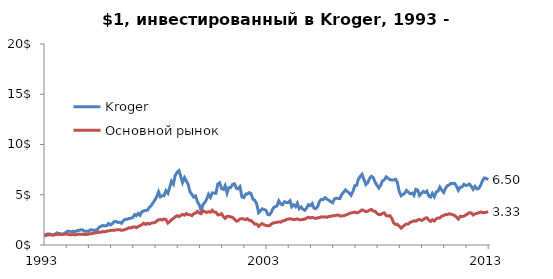
| Category | Kroger | Основной рынок |
|---|---|---|
| 1993-01-04 | 1 | 1 |
| 1993-02-01 | 0.929 | 1.01 |
| 1993-03-01 | 1.094 | 1.029 |
| 1993-04-01 | 1.107 | 1.003 |
| 1993-05-03 | 1.023 | 1.026 |
| 1993-06-01 | 0.987 | 1.027 |
| 1993-07-01 | 1.036 | 1.021 |
| 1993-08-02 | 1.209 | 1.056 |
| 1993-09-01 | 1.15 | 1.046 |
| 1993-10-01 | 1.122 | 1.066 |
| 1993-11-01 | 1.064 | 1.052 |
| 1993-12-01 | 1.15 | 1.063 |
| 1994-01-03 | 1.272 | 1.098 |
| 1994-02-01 | 1.379 | 1.065 |
| 1994-03-01 | 1.364 | 1.016 |
| 1994-04-04 | 1.3 | 1.028 |
| 1994-05-02 | 1.364 | 1.04 |
| 1994-06-01 | 1.328 | 1.013 |
| 1994-07-01 | 1.43 | 1.044 |
| 1994-08-01 | 1.45 | 1.084 |
| 1994-09-01 | 1.522 | 1.055 |
| 1994-10-03 | 1.494 | 1.077 |
| 1994-11-01 | 1.372 | 1.034 |
| 1994-12-01 | 1.379 | 1.047 |
| 1995-01-03 | 1.351 | 1.072 |
| 1995-02-01 | 1.501 | 1.111 |
| 1995-03-01 | 1.509 | 1.141 |
| 1995-04-03 | 1.45 | 1.173 |
| 1995-05-01 | 1.486 | 1.216 |
| 1995-06-01 | 1.537 | 1.242 |
| 1995-07-03 | 1.779 | 1.281 |
| 1995-08-01 | 1.865 | 1.281 |
| 1995-09-01 | 1.952 | 1.332 |
| 1995-10-02 | 1.908 | 1.325 |
| 1995-11-01 | 1.916 | 1.38 |
| 1995-12-01 | 2.137 | 1.404 |
| 1996-01-02 | 1.987 | 1.45 |
| 1996-02-01 | 2.122 | 1.46 |
| 1996-03-01 | 2.316 | 1.471 |
| 1996-04-01 | 2.351 | 1.491 |
| 1996-05-01 | 2.244 | 1.525 |
| 1996-06-03 | 2.26 | 1.528 |
| 1996-07-01 | 2.158 | 1.458 |
| 1996-08-01 | 2.422 | 1.486 |
| 1996-09-03 | 2.56 | 1.566 |
| 1996-10-01 | 2.552 | 1.607 |
| 1996-11-01 | 2.639 | 1.725 |
| 1996-12-02 | 2.659 | 1.688 |
| 1997-01-02 | 2.73 | 1.792 |
| 1997-02-03 | 3.031 | 1.802 |
| 1997-03-03 | 2.916 | 1.726 |
| 1997-04-01 | 3.145 | 1.826 |
| 1997-05-01 | 2.959 | 1.933 |
| 1997-06-02 | 3.316 | 2.017 |
| 1997-07-01 | 3.382 | 2.175 |
| 1997-08-01 | 3.445 | 2.05 |
| 1997-09-02 | 3.453 | 2.159 |
| 1997-10-01 | 3.733 | 2.084 |
| 1997-11-03 | 3.939 | 2.177 |
| 1997-12-01 | 4.204 | 2.212 |
| 1998-01-02 | 4.476 | 2.234 |
| 1998-02-02 | 4.832 | 2.391 |
| 1998-03-02 | 5.282 | 2.511 |
| 1998-04-01 | 4.789 | 2.534 |
| 1998-05-01 | 4.911 | 2.486 |
| 1998-06-01 | 4.903 | 2.584 |
| 1998-07-01 | 5.41 | 2.554 |
| 1998-08-03 | 5.145 | 2.182 |
| 1998-09-01 | 5.718 | 2.318 |
| 1998-10-01 | 6.346 | 2.504 |
| 1998-11-02 | 6.069 | 2.652 |
| 1998-12-01 | 6.919 | 2.801 |
| 1999-01-04 | 7.262 | 2.916 |
| 1999-02-01 | 7.397 | 2.822 |
| 1999-03-01 | 6.847 | 2.932 |
| 1999-04-01 | 6.211 | 3.043 |
| 1999-05-03 | 6.697 | 2.967 |
| 1999-06-01 | 6.389 | 3.128 |
| 1999-07-01 | 6.048 | 3.028 |
| 1999-08-02 | 5.288 | 3.009 |
| 1999-09-01 | 5.046 | 2.923 |
| 1999-10-01 | 4.761 | 3.106 |
| 1999-11-01 | 4.875 | 3.165 |
| 1999-12-01 | 4.316 | 3.348 |
| 2000-01-03 | 3.972 | 3.178 |
| 2000-02-01 | 3.417 | 3.114 |
| 2000-03-01 | 4.015 | 3.415 |
| 2000-04-03 | 4.244 | 3.31 |
| 2000-05-01 | 4.545 | 3.238 |
| 2000-06-01 | 5.046 | 3.315 |
| 2000-07-03 | 4.733 | 3.261 |
| 2000-08-01 | 5.191 | 3.459 |
| 2000-09-01 | 5.16 | 3.274 |
| 2000-10-02 | 5.16 | 3.258 |
| 2000-11-01 | 6.061 | 2.997 |
| 2000-12-01 | 6.188 | 3.009 |
| 2001-01-02 | 5.616 | 3.113 |
| 2001-02-01 | 5.545 | 2.826 |
| 2001-03-01 | 5.898 | 2.644 |
| 2001-04-02 | 5.168 | 2.848 |
| 2001-05-01 | 5.705 | 2.862 |
| 2001-06-01 | 5.718 | 2.79 |
| 2001-07-02 | 6.028 | 2.76 |
| 2001-08-01 | 6.089 | 2.583 |
| 2001-09-04 | 5.636 | 2.372 |
| 2001-10-01 | 5.595 | 2.415 |
| 2001-11-01 | 5.791 | 2.597 |
| 2001-12-03 | 4.774 | 2.617 |
| 2002-01-02 | 4.712 | 2.576 |
| 2002-02-04 | 5.066 | 2.522 |
| 2002-03-01 | 5.069 | 2.615 |
| 2002-04-01 | 5.209 | 2.454 |
| 2002-05-01 | 5.112 | 2.432 |
| 2002-06-03 | 4.552 | 2.256 |
| 2002-07-01 | 4.455 | 2.078 |
| 2002-08-01 | 4.135 | 2.088 |
| 2002-09-03 | 3.224 | 1.858 |
| 2002-10-01 | 3.384 | 2.019 |
| 2002-11-01 | 3.598 | 2.134 |
| 2002-12-02 | 3.534 | 2.005 |
| 2003-01-02 | 3.45 | 1.95 |
| 2003-02-03 | 3.023 | 1.917 |
| 2003-03-03 | 3.008 | 1.933 |
| 2003-04-01 | 3.27 | 2.09 |
| 2003-05-01 | 3.672 | 2.196 |
| 2003-06-02 | 3.814 | 2.221 |
| 2003-07-01 | 3.878 | 2.257 |
| 2003-08-01 | 4.394 | 2.297 |
| 2003-09-02 | 4.087 | 2.27 |
| 2003-10-01 | 4 | 2.395 |
| 2003-11-03 | 4.313 | 2.412 |
| 2003-12-01 | 4.234 | 2.534 |
| 2004-01-02 | 4.239 | 2.578 |
| 2004-02-02 | 4.397 | 2.609 |
| 2004-03-01 | 3.807 | 2.567 |
| 2004-04-01 | 4.003 | 2.524 |
| 2004-05-03 | 3.817 | 2.554 |
| 2004-06-01 | 4.163 | 2.6 |
| 2004-07-01 | 3.613 | 2.511 |
| 2004-08-02 | 3.781 | 2.517 |
| 2004-09-01 | 3.55 | 2.54 |
| 2004-10-01 | 3.455 | 2.576 |
| 2004-11-01 | 3.7 | 2.675 |
| 2004-12-01 | 4.013 | 2.762 |
| 2005-01-03 | 3.911 | 2.692 |
| 2005-02-01 | 4.115 | 2.743 |
| 2005-03-01 | 3.667 | 2.691 |
| 2005-04-01 | 3.608 | 2.637 |
| 2005-05-02 | 3.835 | 2.715 |
| 2005-06-01 | 4.354 | 2.715 |
| 2005-07-01 | 4.539 | 2.813 |
| 2005-08-01 | 4.514 | 2.781 |
| 2005-09-01 | 4.71 | 2.801 |
| 2005-10-03 | 4.552 | 2.751 |
| 2005-11-01 | 4.45 | 2.848 |
| 2005-12-01 | 4.318 | 2.845 |
| 2006-01-03 | 4.209 | 2.917 |
| 2006-02-01 | 4.583 | 2.919 |
| 2006-03-01 | 4.656 | 2.951 |
| 2006-04-03 | 4.634 | 2.987 |
| 2006-05-01 | 4.613 | 2.895 |
| 2006-06-01 | 5.015 | 2.895 |
| 2006-07-03 | 5.262 | 2.91 |
| 2006-08-01 | 5.478 | 2.971 |
| 2006-09-01 | 5.326 | 3.044 |
| 2006-10-02 | 5.176 | 3.14 |
| 2006-11-01 | 4.952 | 3.192 |
| 2006-12-01 | 5.323 | 3.232 |
| 2007-01-03 | 5.908 | 3.278 |
| 2007-02-01 | 5.931 | 3.206 |
| 2007-03-01 | 6.537 | 3.238 |
| 2007-04-02 | 6.827 | 3.378 |
| 2007-05-01 | 7.033 | 3.488 |
| 2007-06-01 | 6.524 | 3.426 |
| 2007-07-02 | 6.023 | 3.317 |
| 2007-08-01 | 6.183 | 3.359 |
| 2007-09-04 | 6.636 | 3.48 |
| 2007-10-01 | 6.837 | 3.531 |
| 2007-11-01 | 6.707 | 3.376 |
| 2007-12-03 | 6.232 | 3.346 |
| 2008-01-02 | 5.939 | 3.142 |
| 2008-02-01 | 5.674 | 3.033 |
| 2008-03-03 | 5.944 | 3.014 |
| 2008-04-01 | 6.377 | 3.158 |
| 2008-05-01 | 6.489 | 3.192 |
| 2008-06-02 | 6.779 | 2.917 |
| 2008-07-01 | 6.639 | 2.888 |
| 2008-08-01 | 6.504 | 2.924 |
| 2008-09-02 | 6.471 | 2.658 |
| 2008-10-01 | 6.466 | 2.208 |
| 2008-11-03 | 6.534 | 2.043 |
| 2008-12-01 | 6.239 | 2.059 |
| 2009-01-02 | 5.316 | 1.882 |
| 2009-02-02 | 4.903 | 1.675 |
| 2009-03-02 | 5.033 | 1.818 |
| 2009-04-01 | 5.13 | 1.989 |
| 2009-05-01 | 5.433 | 2.095 |
| 2009-06-01 | 5.252 | 2.095 |
| 2009-07-01 | 5.094 | 2.251 |
| 2009-08-03 | 5.165 | 2.326 |
| 2009-09-01 | 4.939 | 2.409 |
| 2009-10-01 | 5.534 | 2.362 |
| 2009-11-02 | 5.463 | 2.497 |
| 2009-12-01 | 4.931 | 2.541 |
| 2010-01-04 | 5.148 | 2.447 |
| 2010-02-01 | 5.333 | 2.517 |
| 2010-03-01 | 5.226 | 2.665 |
| 2010-04-01 | 5.364 | 2.705 |
| 2010-05-03 | 4.878 | 2.483 |
| 2010-06-01 | 4.771 | 2.349 |
| 2010-07-01 | 5.132 | 2.511 |
| 2010-08-02 | 4.802 | 2.391 |
| 2010-09-01 | 5.272 | 2.601 |
| 2010-10-01 | 5.354 | 2.697 |
| 2010-11-01 | 5.758 | 2.691 |
| 2010-12-01 | 5.468 | 2.866 |
| 2011-01-03 | 5.232 | 2.931 |
| 2011-02-01 | 5.626 | 3.025 |
| 2011-03-01 | 5.888 | 3.022 |
| 2011-04-01 | 5.972 | 3.108 |
| 2011-05-02 | 6.122 | 3.066 |
| 2011-06-01 | 6.12 | 3.01 |
| 2011-07-01 | 6.135 | 2.945 |
| 2011-08-01 | 5.84 | 2.778 |
| 2011-09-01 | 5.443 | 2.579 |
| 2011-10-03 | 5.746 | 2.856 |
| 2011-11-01 | 5.776 | 2.842 |
| 2011-12-01 | 6.036 | 2.866 |
| 2012-01-03 | 5.921 | 2.991 |
| 2012-02-01 | 5.957 | 3.112 |
| 2012-03-01 | 6.066 | 3.21 |
| 2012-04-02 | 5.827 | 3.186 |
| 2012-05-01 | 5.539 | 2.986 |
| 2012-06-01 | 5.835 | 3.104 |
| 2012-07-02 | 5.578 | 3.144 |
| 2012-08-01 | 5.636 | 3.206 |
| 2012-09-04 | 5.954 | 3.283 |
| 2012-10-01 | 6.379 | 3.218 |
| 2012-11-01 | 6.677 | 3.228 |
| 2012-12-03 | 6.621 | 3.25 |
| 2013-01-02 | 6.501 | 3.33 |